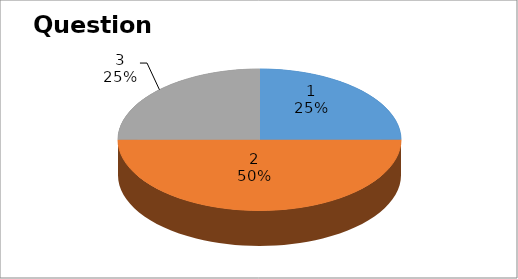
| Category | Series 0 |
|---|---|
| 0 | 2 |
| 1 | 4 |
| 2 | 2 |